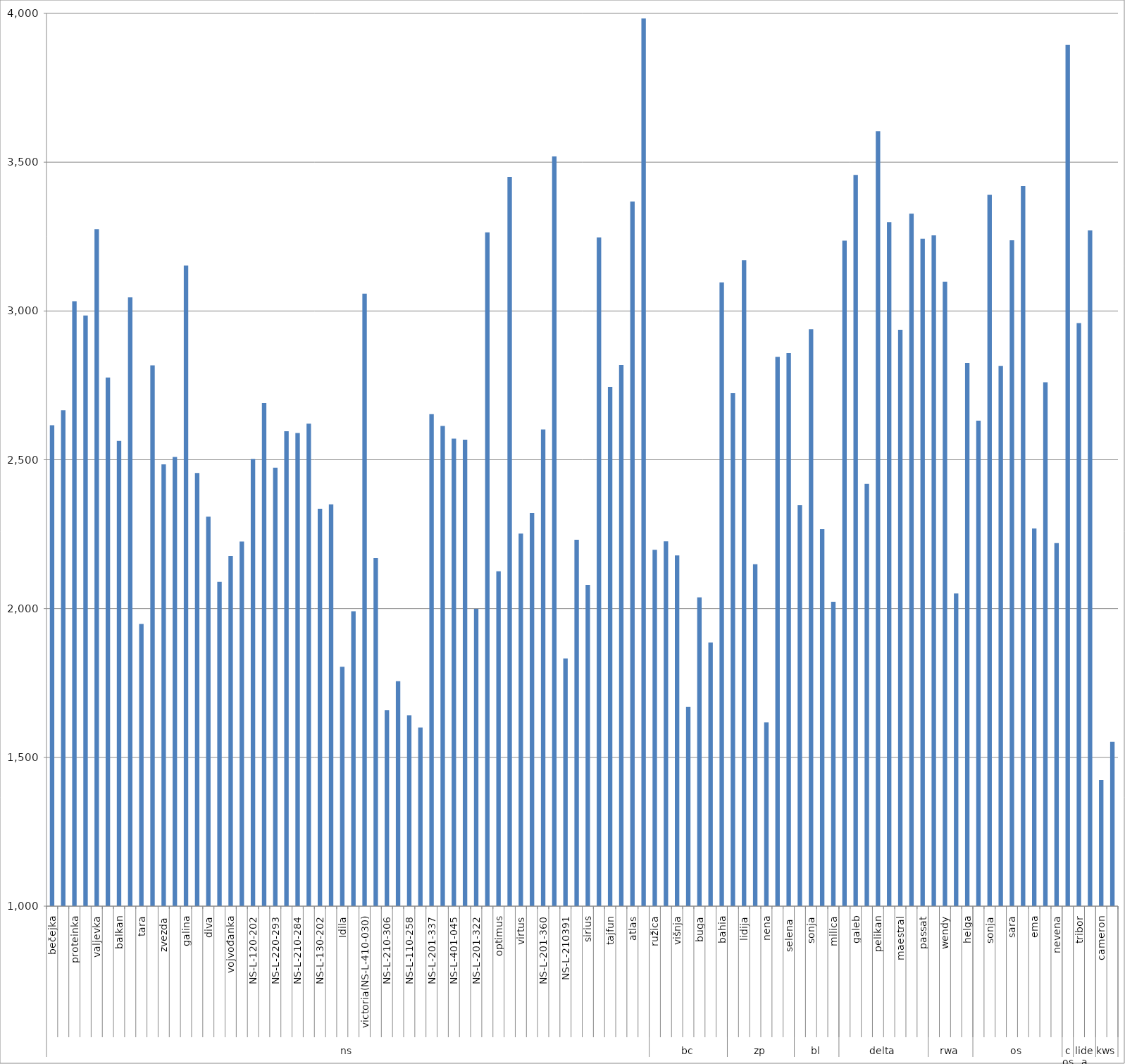
| Category | Series 0 |
|---|---|
| 0 | 2615.836 |
| 1 | 2666.375 |
| 2 | 3033 |
| 3 | 2985 |
| 4 | 3274.849 |
| 5 | 2776.475 |
| 6 | 2563.597 |
| 7 | 3045.533 |
| 8 | 1948.067 |
| 9 | 2817.53 |
| 10 | 2484.667 |
| 11 | 2509.4 |
| 12 | 3152.807 |
| 13 | 2455.667 |
| 14 | 2309.083 |
| 15 | 2089.7 |
| 16 | 2176.988 |
| 17 | 2225.3 |
| 18 | 2502.95 |
| 19 | 2690.633 |
| 20 | 2473.5 |
| 21 | 2595.6 |
| 22 | 2589.7 |
| 23 | 2621.567 |
| 24 | 2335.5 |
| 25 | 2350.175 |
| 26 | 1804.226 |
| 27 | 1991 |
| 28 | 3057.953 |
| 29 | 2169.867 |
| 30 | 1658 |
| 31 | 1756 |
| 32 | 1641 |
| 33 | 1600 |
| 34 | 2653.291 |
| 35 | 2613.821 |
| 36 | 2570.741 |
| 37 | 2567.559 |
| 38 | 1999.275 |
| 39 | 3264.453 |
| 40 | 2125.5 |
| 41 | 3450.5 |
| 42 | 2252 |
| 43 | 2321 |
| 44 | 2602 |
| 45 | 3519.503 |
| 46 | 1832 |
| 47 | 2231 |
| 48 | 2080 |
| 49 | 3246.954 |
| 50 | 2745.329 |
| 51 | 2818.667 |
| 52 | 3367.962 |
| 53 | 3982.56 |
| 54 | 2197.71 |
| 55 | 2225.87 |
| 56 | 2178.6 |
| 57 | 1670.31 |
| 58 | 2037.4 |
| 59 | 1886.2 |
| 60 | 3095.8 |
| 61 | 2723.6 |
| 62 | 3170.862 |
| 63 | 2149.1 |
| 64 | 1617.2 |
| 65 | 2845.75 |
| 66 | 2858.677 |
| 67 | 2347.333 |
| 68 | 2938.511 |
| 69 | 2266.807 |
| 70 | 2022.993 |
| 71 | 3236.211 |
| 72 | 3457.004 |
| 73 | 2419 |
| 74 | 3603.737 |
| 75 | 3298.611 |
| 76 | 2937 |
| 77 | 3327 |
| 78 | 3243 |
| 79 | 3254.087 |
| 80 | 3098.75 |
| 81 | 2050.5 |
| 82 | 2825.5 |
| 83 | 2631.545 |
| 84 | 3390.209 |
| 85 | 2815.567 |
| 86 | 3237.52 |
| 87 | 3419.849 |
| 88 | 2269 |
| 89 | 2760.444 |
| 90 | 2220 |
| 91 | 3894.163 |
| 92 | 2959.5 |
| 93 | 3270.667 |
| 94 | 1424 |
| 95 | 1552 |